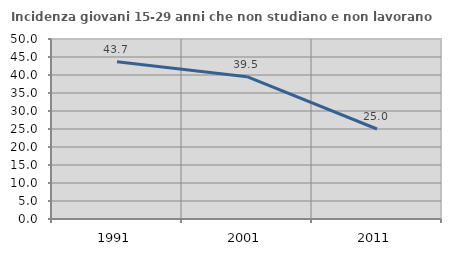
| Category | Incidenza giovani 15-29 anni che non studiano e non lavorano  |
|---|---|
| 1991.0 | 43.661 |
| 2001.0 | 39.541 |
| 2011.0 | 25 |